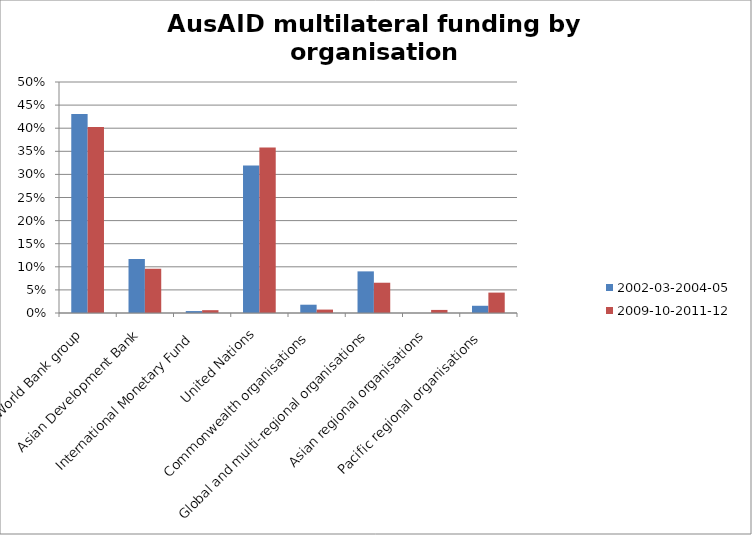
| Category | 2002-03-2004-05 | 2009-10-2011-12 |
|---|---|---|
| World Bank group | 0.431 | 0.402 |
| Asian Development Bank  | 0.117 | 0.096 |
| International Monetary Fund  | 0.004 | 0.006 |
| United Nations  | 0.319 | 0.358 |
| Commonwealth organisations  | 0.018 | 0.007 |
| Global and multi-regional organisations | 0.09 | 0.066 |
| Asian regional organisations | 0 | 0.007 |
| Pacific regional organisations  | 0.016 | 0.044 |